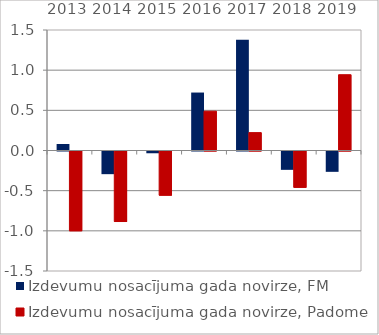
| Category | Izdevumu nosacījuma gada novirze, FM | Izdevumu nosacījuma gada novirze, Padome |
|---|---|---|
| 2013.0 | 0.081 | -0.993 |
| 2014.0 | -0.282 | -0.878 |
| 2015.0 | -0.022 | -0.55 |
| 2016.0 | 0.721 | 0.489 |
| 2017.0 | 1.38 | 0.223 |
| 2018.0 | -0.228 | -0.452 |
| 2019.0 | -0.253 | 0.943 |